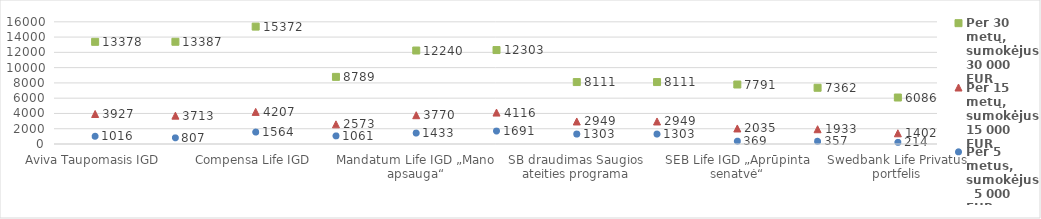
| Category | Per 30 metų, sumokėjus 30 000 EUR | Per 15 metų, sumokėjus 15 000 EUR | Per 5 metus, sumokėjus    5 000 EUR |
|---|---|---|---|
| Aviva Taupomasis IGD | 13377.8 | 3926.95 | 1015.89 |
| Aviva VIP pensinis GD | 13387.4 | 3712.66 | 806.54 |
| Compensa Life IGD | 15371.946 | 4206.738 | 1564.226 |
| ERGO Life Universalus GD | 8788.77 | 2573.15 | 1060.82 |
| Mandatum Life IGD „Mano apsauga“ | 12240.39 | 3770.35 | 1432.57 |
| PZU gyvybė IGD be DR | 12302.517 | 4115.54 | 1691.437 |
| SB draudimas Saugios ateities programa | 8111.24 | 2949.08 | 1302.531 |
| SB draudimas Pensijų programa | 8111.24 | 2949.08 | 1302.531 |
| SEB Life IGD „Aprūpinta senatvė“ | 7791.421 | 2034.548 | 369.317 |
| SEB Life IGD „SEB verslui“ | 7362.271 | 1932.892 | 357.318 |
| Swedbank Life Privatus portfelis | 6086.06 | 1401.67 | 213.84 |